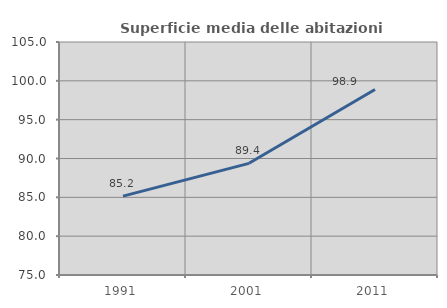
| Category | Superficie media delle abitazioni occupate |
|---|---|
| 1991.0 | 85.157 |
| 2001.0 | 89.378 |
| 2011.0 | 98.877 |